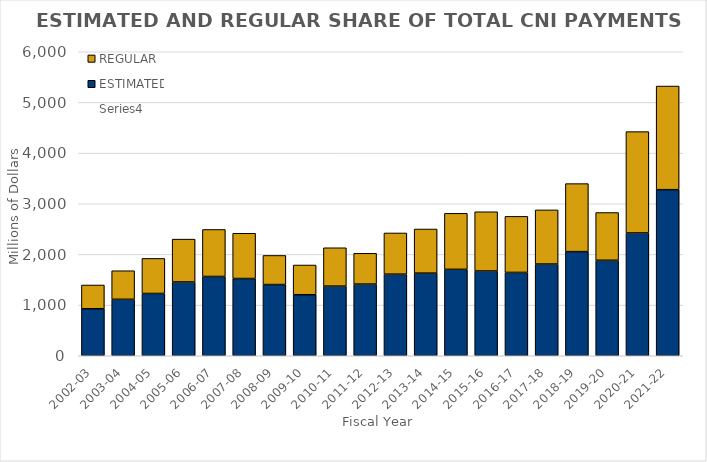
| Category | ESTIMATED | REGULAR |
|---|---|---|
| 2002-03 | 927.5 | 469.1 |
| 2003-04 | 1114.4 | 563.6 |
| 2004-05 | 1229.3 | 692.1 |
| 2005-06 | 1456.4 | 845.6 |
| 2006-07 | 1564.8 | 927.7 |
| 2007-08 | 1524.1 | 893.6 |
| 2008-09 | 1405.2 | 574.7 |
| 2009-10 | 1204.279 | 586.684 |
| 2010-11 | 1374.453 | 756.998 |
| 2011-12 | 1414.7 | 607.7 |
| 2012-13 | 1610.668 | 812.773 |
| 2013-14 | 1630.842 | 870.793 |
| 2014-15 | 1705.6 | 1105.9 |
| 2015-16 | 1673.5 | 1168.8 |
| 2016-17 | 1644.9 | 1106.5 |
| 2017-18 | 1810.292 | 1068.732 |
| 2018-19 | 2055.199 | 1342.344 |
| 2019-20 | 1884.699 | 942.181 |
| 2020-21 | 2423.841 | 1999.918 |
| 2021-22 | 3278.139 | 2044.952 |